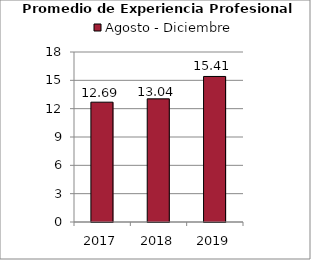
| Category | Agosto - Diciembre |
|---|---|
| 2017.0 | 12.687 |
| 2018.0 | 13.04 |
| 2019.0 | 15.41 |